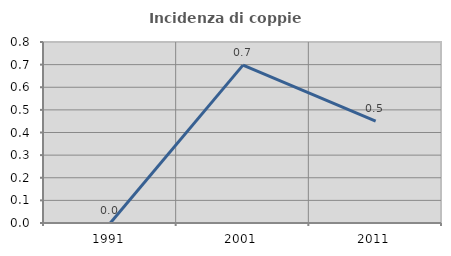
| Category | Incidenza di coppie miste |
|---|---|
| 1991.0 | 0 |
| 2001.0 | 0.698 |
| 2011.0 | 0.45 |